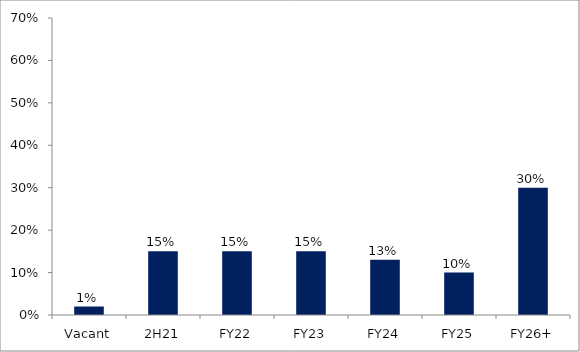
| Category | Series 0 |
|---|---|
| Vacant | 0.02 |
| 2H21 | 0.15 |
| FY22 | 0.15 |
| FY23 | 0.15 |
| FY24 | 0.13 |
| FY25 | 0.1 |
| FY26+ | 0.3 |